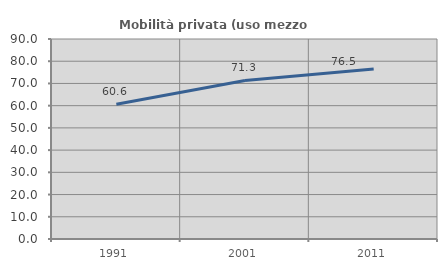
| Category | Mobilità privata (uso mezzo privato) |
|---|---|
| 1991.0 | 60.624 |
| 2001.0 | 71.337 |
| 2011.0 | 76.522 |